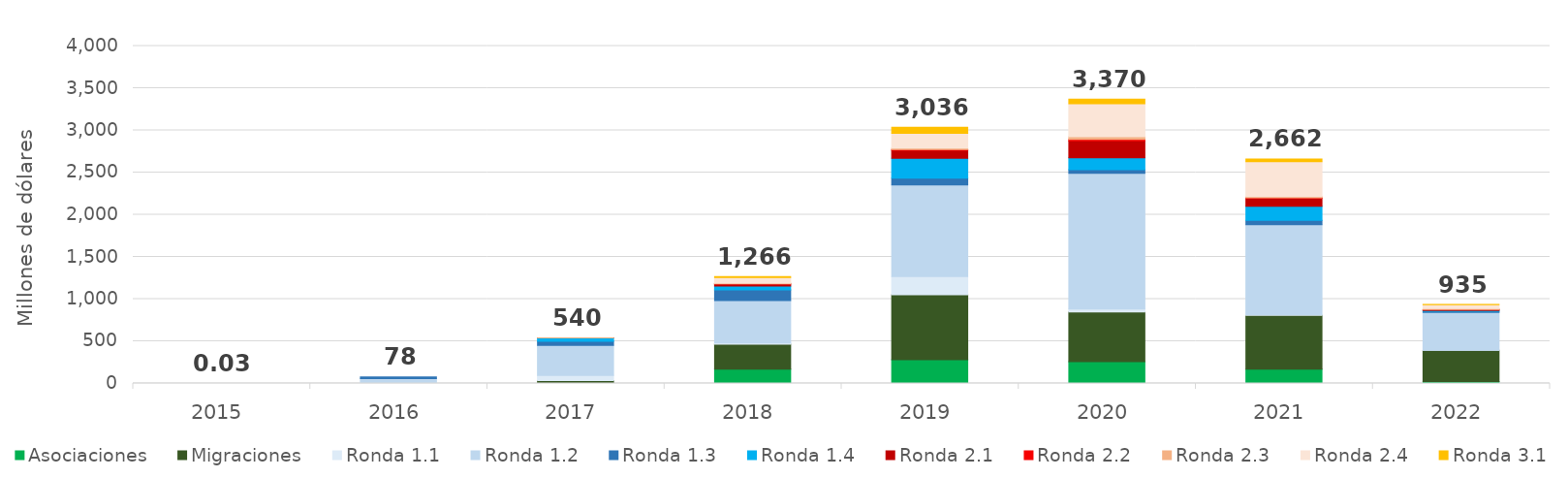
| Category | Asociaciones | Migraciones | Ronda 1.1 | Ronda 1.2 | Ronda 1.3 | Ronda 1.4 | Ronda 2.1 | Ronda 2.2 | Ronda 2.3 | Ronda 2.4 | Ronda 3.1 |
|---|---|---|---|---|---|---|---|---|---|---|---|
| 2015.0 | 0 | 0 | 0.023 | 0.003 | 0 | 0 | 0 | 0 | 0 | 0 | 0 |
| 2016.0 | 0 | 0 | 7.936 | 50.902 | 19.085 | 0 | 0 | 0 | 0 | 0 | 0 |
| 2017.0 | 1.551 | 32.93 | 60.276 | 356.292 | 49.062 | 38.707 | 0.93 | 0 | 0.096 | 0 | 0 |
| 2018.0 | 168.66 | 295.724 | 16.154 | 501.142 | 126.084 | 47.616 | 24.075 | 1.091 | 9.662 | 66.299 | 9.669 |
| 2019.0 | 280.617 | 772.208 | 213.486 | 1086.442 | 82.07 | 235.595 | 92.887 | 9.67 | 17.942 | 175.703 | 69.349 |
| 2020.0 | 258.021 | 590.016 | 33.998 | 1610.735 | 43.009 | 140.295 | 200.372 | 18.149 | 30.336 | 391.695 | 53.276 |
| 2021.0 | 169.637 | 638.47 | 8.662 | 1065.356 | 51.023 | 167.952 | 94.808 | 3.959 | 16.887 | 411.971 | 33.571 |
| 2022.0 | 21.717 | 373.006 | 0.096 | 446.345 | 14.763 | 8.955 | 10.248 | 0.057 | 13.324 | 46.696 | 0.208 |